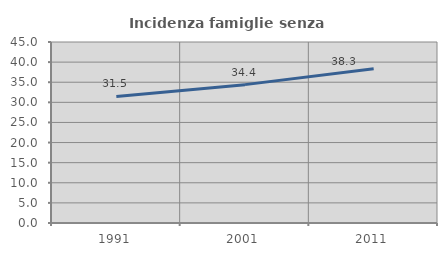
| Category | Incidenza famiglie senza nuclei |
|---|---|
| 1991.0 | 31.469 |
| 2001.0 | 34.4 |
| 2011.0 | 38.333 |